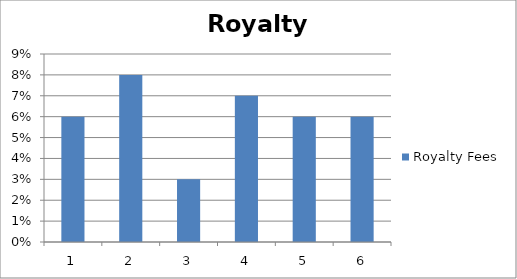
| Category | Royalty Fees |
|---|---|
| 0 | 0.06 |
| 1 | 0.08 |
| 2 | 0.03 |
| 3 | 0.07 |
| 4 | 0.06 |
| 5 | 0.06 |